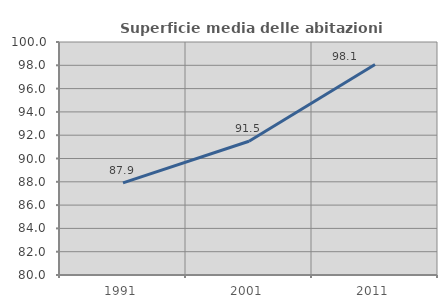
| Category | Superficie media delle abitazioni occupate |
|---|---|
| 1991.0 | 87.906 |
| 2001.0 | 91.483 |
| 2011.0 | 98.064 |